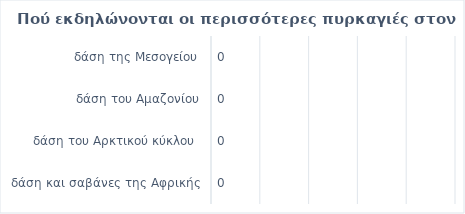
| Category | Series 0 |
|---|---|
| δάση και σαβάνες της Αφρικής | 0 |
| δάση του Αρκτικού κύκλου  | 0 |
| δάση του Αμαζονίου | 0 |
| δάση της Μεσογείου | 0 |